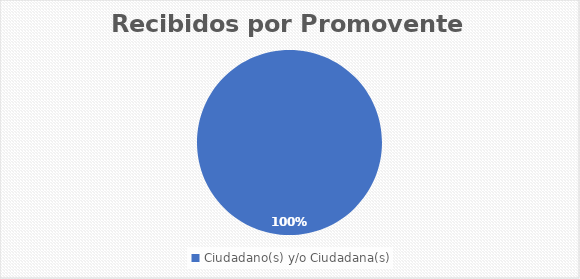
| Category | Rubro Cantidad |
|---|---|
| Ciudadano(s) y/o Ciudadana(s) | 8 |